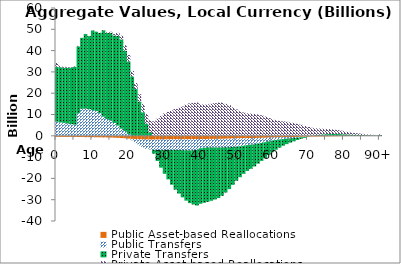
| Category | Public Asset-based Reallocations | Public Transfers | Private Transfers | Private Asset-based Reallocations |
|---|---|---|---|---|
| 0 | -490.692 | 6609.964 | 25797.838 | 1848.723 |
|  | -494.131 | 6288.233 | 25890.237 | 621.304 |
| 2 | -496.348 | 6042.242 | 25918.782 | 463.708 |
| 3 | -501.32 | 5778.66 | 26081.943 | 339.941 |
| 4 | -511.72 | 5495.332 | 26491.017 | 268.465 |
| 5 | -528.914 | 5211.9 | 27227.775 | 250.375 |
| 6 | -552.434 | 10616.162 | 31361.373 | 271.318 |
| 7 | -578.415 | 12715.409 | 33283.833 | 6.228 |
| 8 | -605.126 | 12752.725 | 35064.352 | -84.555 |
| 9 | -631.904 | 12488.2 | 34298.746 | 21.461 |
| 10 | -658.609 | 12092.697 | 37342.04 | -180.716 |
| 11 | -682.925 | 11601.52 | 37257.692 | 66.007 |
| 12 | -708.598 | 10623.817 | 37680.638 | 94.788 |
| 13 | -736.62 | 8971.459 | 40549.447 | -99.716 |
| 14 | -766.361 | 7892.705 | 40426.161 | 296.688 |
| 15 | -826.263 | 7133.219 | 41268.813 | 434.436 |
| 16 | -881.141 | 6017.617 | 41108.008 | 622.904 |
| 17 | -968.306 | 4795.769 | 42100.639 | 1446.324 |
| 18 | -1061.254 | 3362.79 | 41889.562 | 1750.698 |
| 19 | -1172.762 | 2245.03 | 37763.752 | 2509.724 |
| 20 | -1299.152 | 875.212 | 34039.008 | 3020.792 |
| 21 | -1454.361 | -640.102 | 27867.997 | 2594.838 |
| 22 | -1574.634 | -1855.519 | 21932.401 | 2875.159 |
| 23 | -1671.392 | -2917.34 | 16112.105 | 3448.272 |
| 24 | -1742.875 | -3724.204 | 11039.865 | 3903.711 |
| 25 | -1774.293 | -4345.232 | 5719.922 | 4455.127 |
| 26 | -1786.664 | -4638.638 | 1693.125 | 5601.768 |
| 27 | -1779.907 | -4828.486 | -1775.046 | 6782.23 |
| 28 | -1771.853 | -4960.991 | -5075.323 | 8003.009 |
| 29 | -1744.465 | -4939.877 | -8289.415 | 9346.703 |
| 30 | -1719.982 | -4938.193 | -11211.379 | 10504.693 |
| 31 | -1693.428 | -4922.131 | -13844.64 | 11209.677 |
| 32 | -1674 | -4937.618 | -16338.892 | 11919.344 |
| 33 | -1653.128 | -4946.306 | -18689.769 | 12625.617 |
| 34 | -1641.663 | -5012.739 | -20479.744 | 13160.661 |
| 35 | -1636.625 | -5103.689 | -22161.446 | 13761.107 |
| 36 | -1628.363 | -5175.464 | -23644.819 | 14615.818 |
| 37 | -1618.705 | -5237.214 | -24750.443 | 15179.611 |
| 38 | -1590.734 | -5196.791 | -25457.08 | 15488.7 |
| 39 | -1560.041 | -5136.052 | -26046.759 | 15678.939 |
| 40 | -1527.118 | -4297.459 | -26088.012 | 14912.871 |
| 41 | -1498.952 | -4115.931 | -25838.235 | 14650.283 |
| 42 | -1478.569 | -3945.474 | -25580.33 | 14767.59 |
| 43 | -1468.012 | -3975.315 | -25066.638 | 15016.067 |
| 44 | -1460.271 | -4028.689 | -24434.27 | 15333.427 |
| 45 | -1439.32 | -4032.774 | -23761.699 | 15594.78 |
| 46 | -1413.932 | -4032.606 | -22723.298 | 15592.095 |
| 47 | -1370.044 | -4007.022 | -21262.954 | 14988.483 |
| 48 | -1333.187 | -4035.733 | -19659.583 | 14348.171 |
| 49 | -1278.419 | -3974.4 | -17780.459 | 13357.756 |
| 50 | -1228.033 | -3880.791 | -15984.94 | 12377.338 |
| 51 | -1171.362 | -3728.54 | -14524.416 | 11518.749 |
| 52 | -1123.568 | -3547.588 | -13205.852 | 10960.152 |
| 53 | -1081.036 | -3303.451 | -12138.339 | 10551.559 |
| 54 | -1052.806 | -3118.384 | -11311.879 | 10453.219 |
| 55 | -1020.387 | -2937.948 | -10437.97 | 10291.448 |
| 56 | -986.622 | -2673.997 | -9412.416 | 10061.133 |
| 57 | -948.078 | -2399.284 | -8437.422 | 9641.771 |
| 58 | -900.509 | -2105.313 | -7426.072 | 9086.375 |
| 59 | -847.154 | -1772.698 | -6362.505 | 8372.546 |
| 60 | -799.576 | -1446.235 | -5418.64 | 7816.136 |
| 61 | -756.098 | -1204.859 | -4594.175 | 7349.475 |
| 62 | -719.997 | -1013.357 | -3844.783 | 7023.476 |
| 63 | -685.91 | -842.621 | -3151.921 | 6758.134 |
| 64 | -654.499 | -697.917 | -2559.854 | 6574.951 |
| 65 | -620.525 | -573.292 | -2013.509 | 6313.743 |
| 66 | -587.445 | -459.447 | -1535.268 | 6065.005 |
| 67 | -541.962 | -307.598 | -1091.706 | 5655.47 |
| 68 | -496.526 | -196.469 | -714.402 | 5180.744 |
| 69 | -450.957 | -123.83 | -381.583 | 4651.632 |
| 70 | -407.687 | -60.807 | -113.941 | 4152.213 |
| 71 | -365.545 | -14.061 | 118.663 | 3631.863 |
| 72 | -329.422 | 24.431 | 299.136 | 3201.953 |
| 73 | -300.239 | 62.884 | 440.435 | 2901.827 |
| 74 | -277.928 | 96.393 | 559.955 | 2678.478 |
| 75 | -256.651 | 112.796 | 653.056 | 2465.558 |
| 76 | -237.721 | 115.371 | 710.719 | 2314.776 |
| 77 | -217.067 | 106.392 | 745.549 | 2142.151 |
| 78 | -193.039 | 89.589 | 749.168 | 1907.382 |
| 79 | -166.526 | 68.703 | 712.521 | 1656.532 |
| 80 | -142.03 | 51.618 | 670.263 | 1426.918 |
| 81 | -118.917 | 35.974 | 615.366 | 1195.169 |
| 82 | -98.489 | 22.125 | 554.081 | 987.938 |
| 83 | -81.847 | 9.862 | 494.091 | 817.432 |
| 84 | -68.155 | -0.62 | 443.806 | 666.572 |
| 85 | -55.353 | -8.847 | 386.435 | 525.213 |
| 86 | -43.573 | -13.991 | 325.967 | 401.864 |
| 87 | -33.566 | -15.873 | 269.321 | 300.1 |
| 88 | -25.443 | -14.445 | 220.389 | 218.709 |
| 89 | -18.954 | -12.623 | 175.992 | 158.917 |
| 90+ | -38.868 | -29.923 | 385.109 | 317.496 |